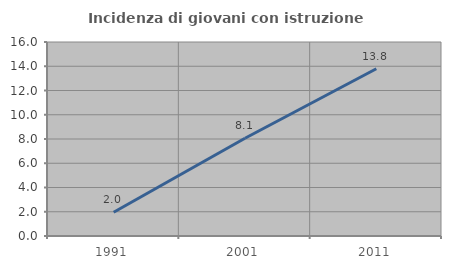
| Category | Incidenza di giovani con istruzione universitaria |
|---|---|
| 1991.0 | 1.961 |
| 2001.0 | 8.065 |
| 2011.0 | 13.793 |